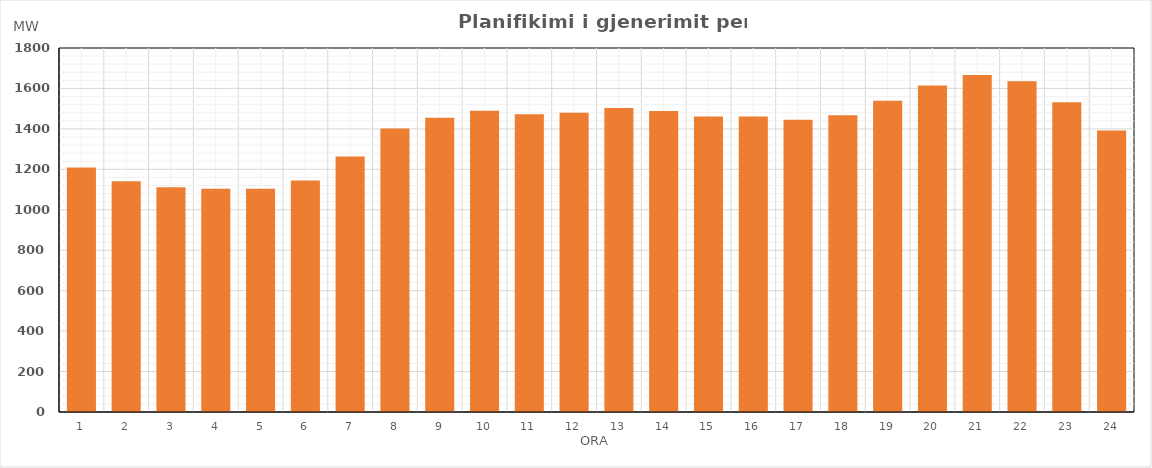
| Category | Max (MW) |
|---|---|
| 0 | 1208.46 |
| 1 | 1140.52 |
| 2 | 1111.21 |
| 3 | 1104.23 |
| 4 | 1103.6 |
| 5 | 1144.97 |
| 6 | 1263.77 |
| 7 | 1401.83 |
| 8 | 1455.23 |
| 9 | 1489.13 |
| 10 | 1472.76 |
| 11 | 1479.25 |
| 12 | 1503.87 |
| 13 | 1488.29 |
| 14 | 1461.57 |
| 15 | 1461.57 |
| 16 | 1444.94 |
| 17 | 1466.87 |
| 18 | 1538.78 |
| 19 | 1614.08 |
| 20 | 1666.45 |
| 21 | 1635.35 |
| 22 | 1532.07 |
| 23 | 1391.48 |